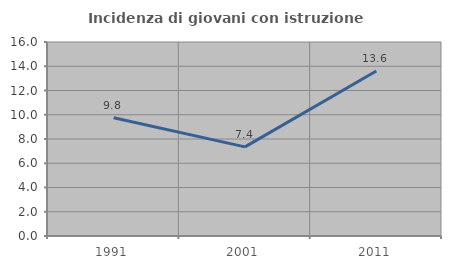
| Category | Incidenza di giovani con istruzione universitaria |
|---|---|
| 1991.0 | 9.756 |
| 2001.0 | 7.353 |
| 2011.0 | 13.613 |